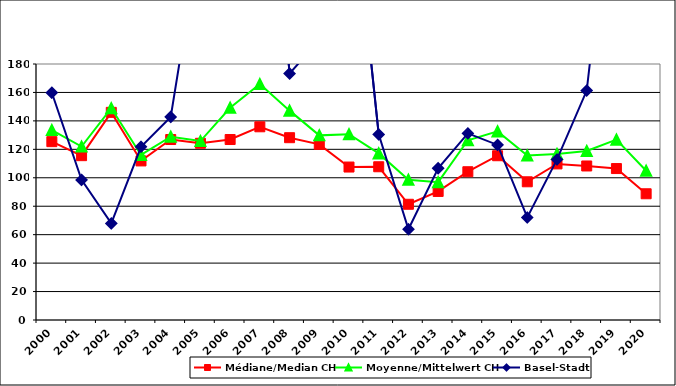
| Category | Médiane/Median CH | Moyenne/Mittelwert CH | Basel-Stadt |
|---|---|---|---|
| 2000.0 | 125.4 | 133.52 | 159.8 |
| 2001.0 | 115.55 | 121.946 | 98.5 |
| 2002.0 | 146 | 148.915 | 67.9 |
| 2003.0 | 111.85 | 116.062 | 121.8 |
| 2004.0 | 126.9 | 128.865 | 142.8 |
| 2005.0 | 124.25 | 125.821 | 271.6 |
| 2006.0 | 126.9 | 149.264 | 211.8 |
| 2007.0 | 135.85 | 165.89 | 417 |
| 2008.0 | 128.185 | 147.205 | 173.3 |
| 2009.0 | 123.49 | 129.818 | 196.8 |
| 2010.0 | 107.55 | 130.614 | 329.1 |
| 2011.0 | 107.75 | 117.142 | 130.5 |
| 2012.0 | 81.375 | 98.616 | 63.8 |
| 2013.0 | 90.385 | 96.916 | 106.7 |
| 2014.0 | 104.25 | 126.395 | 131.2 |
| 2015.0 | 115.5 | 132.601 | 123.1 |
| 2016.0 | 97.18 | 115.652 | 72.1 |
| 2017.0 | 109.75 | 116.719 | 112.9 |
| 2018.0 | 108.3 | 118.861 | 161.3 |
| 2019.0 | 106.48 | 126.798 | 343.1 |
| 2020.0 | 88.75 | 104.921 | 427.9 |